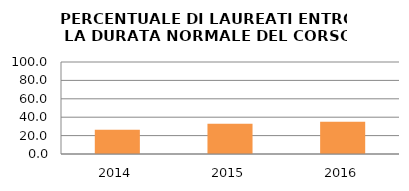
| Category | 2014 2015 2016 |
|---|---|
| 2014.0 | 26.241 |
| 2015.0 | 33 |
| 2016.0 | 35.065 |